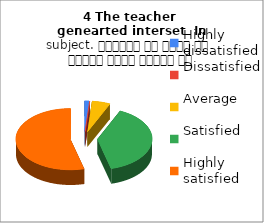
| Category | 4 The teacher 
genearted interset  In subject. शिक्षक ने विषय के प्रति रुचि जागृत की |
|---|---|
| Highly dissatisfied | 1 |
| Dissatisfied | 0 |
| Average | 4 |
| Satisfied | 29 |
| Highly satisfied | 40 |